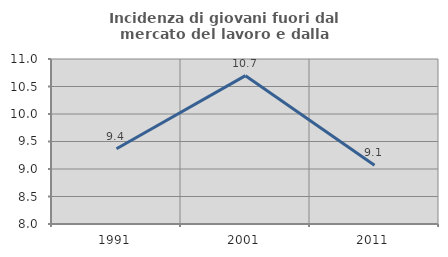
| Category | Incidenza di giovani fuori dal mercato del lavoro e dalla formazione  |
|---|---|
| 1991.0 | 9.369 |
| 2001.0 | 10.697 |
| 2011.0 | 9.067 |